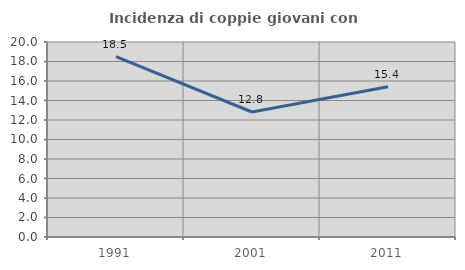
| Category | Incidenza di coppie giovani con figli |
|---|---|
| 1991.0 | 18.509 |
| 2001.0 | 12.821 |
| 2011.0 | 15.407 |